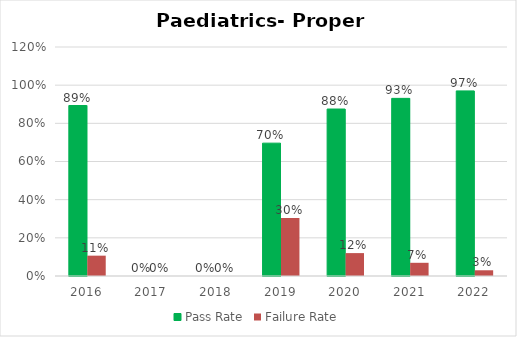
| Category | Pass Rate | Failure Rate |
|---|---|---|
| 2016.0 | 0.893 | 0.107 |
| 2017.0 | 0 | 0 |
| 2018.0 | 0 | 0 |
| 2019.0 | 0.696 | 0.304 |
| 2020.0 | 0.875 | 0.12 |
| 2021.0 | 0.931 | 0.069 |
| 2022.0 | 0.97 | 0.03 |